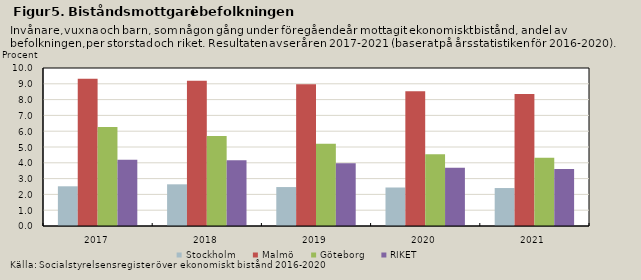
| Category | Stockholm | Malmö | Göteborg | RIKET |
|---|---|---|---|---|
| 2017.0 | 2.513 | 9.326 | 6.262 | 4.2 |
| 2018.0 | 2.638 | 9.195 | 5.698 | 4.159 |
| 2019.0 | 2.465 | 8.972 | 5.206 | 3.978 |
| 2020.0 | 2.437 | 8.521 | 4.546 | 3.69 |
| 2021.0 | 2.403 | 8.358 | 4.322 | 3.604 |